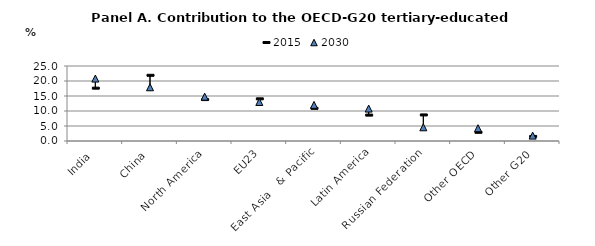
| Category | 2015 | 2030 |
|---|---|---|
| India | 17.611 | 20.813 |
| China | 21.897 | 17.908 |
| North America | 13.803 | 14.779 |
| EU23 | 14.053 | 13.012 |
| East Asia   & Pacific | 10.895 | 12.036 |
| Latin America | 8.628 | 10.817 |
| Russian Federation | 8.688 | 4.571 |
| Other OECD | 2.899 | 4.265 |
| Other G20 | 1.526 | 1.8 |